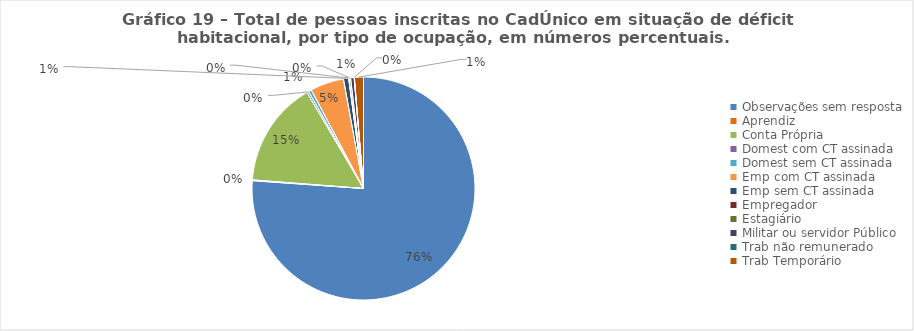
| Category | Series 1 | Series 0 |
|---|---|---|
| Observações sem resposta | 0.761 | 0.761 |
| Aprendiz | 0.001 | 0.001 |
| Conta Própria | 0.153 | 0.153 |
| Domest com CT assinada | 0.003 | 0.003 |
| Domest sem CT assinada | 0.004 | 0.004 |
| Emp com CT assinada | 0.049 | 0.049 |
| Emp sem CT assinada | 0.008 | 0.008 |
| Empregador | 0 | 0 |
| Estagiário | 0.002 | 0.002 |
| Militar ou servidor Público | 0.005 | 0.005 |
| Trab não remunerado | 0 | 0 |
| Trab Temporário | 0.013 | 0.013 |